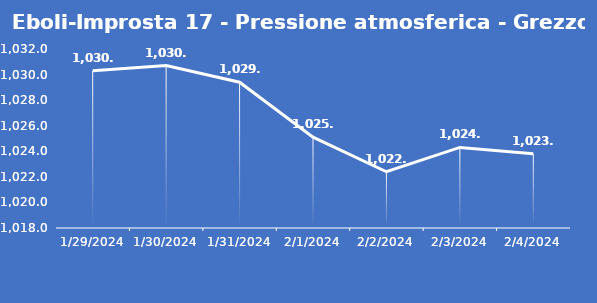
| Category | Eboli-Improsta 17 - Pressione atmosferica - Grezzo (hPa) |
|---|---|
| 1/29/24 | 1030.3 |
| 1/30/24 | 1030.7 |
| 1/31/24 | 1029.4 |
| 2/1/24 | 1025.1 |
| 2/2/24 | 1022.4 |
| 2/3/24 | 1024.3 |
| 2/4/24 | 1023.8 |